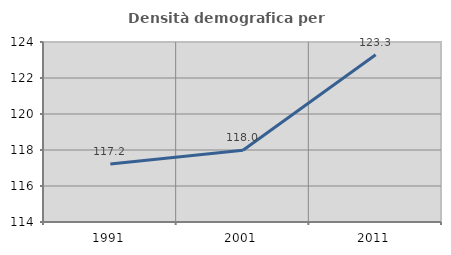
| Category | Densità demografica |
|---|---|
| 1991.0 | 117.225 |
| 2001.0 | 117.99 |
| 2011.0 | 123.296 |